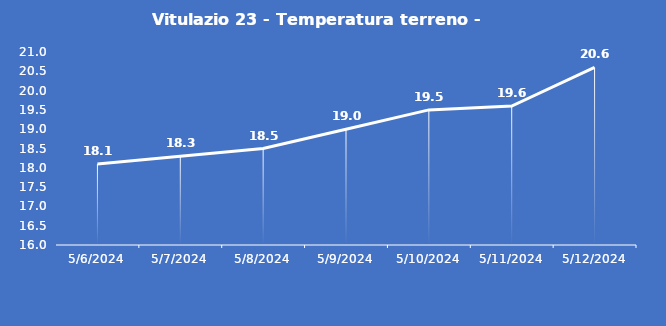
| Category | Vitulazio 23 - Temperatura terreno - Grezzo (°C) |
|---|---|
| 5/6/24 | 18.1 |
| 5/7/24 | 18.3 |
| 5/8/24 | 18.5 |
| 5/9/24 | 19 |
| 5/10/24 | 19.5 |
| 5/11/24 | 19.6 |
| 5/12/24 | 20.6 |